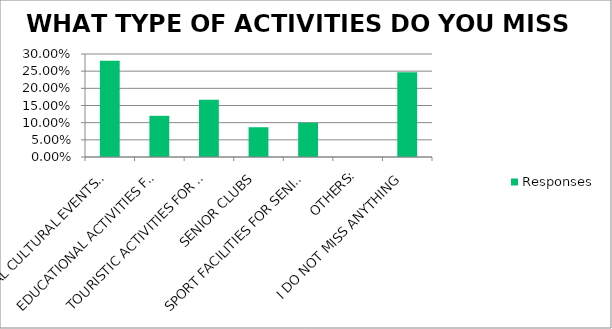
| Category | Responses |
|---|---|
| SPECIAL CULTURAL EVENTS FOR SENIORS | 0.28 |
| EDUCATIONAL ACTIVITIES FOR SENIORS | 0.12 |
| TOURISTIC ACTIVITIES FOR SENIORS | 0.167 |
| SENIOR CLUBS | 0.087 |
| SPORT FACILITIES FOR SENIORS | 0.1 |
| OTHERS: | 0 |
| I DO NOT MISS ANYTHING | 0.247 |